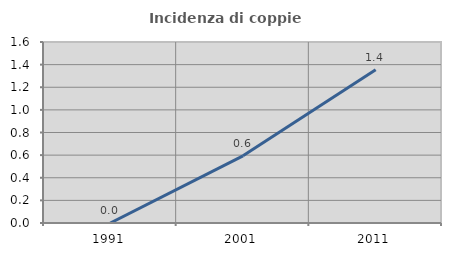
| Category | Incidenza di coppie miste |
|---|---|
| 1991.0 | 0 |
| 2001.0 | 0.594 |
| 2011.0 | 1.355 |